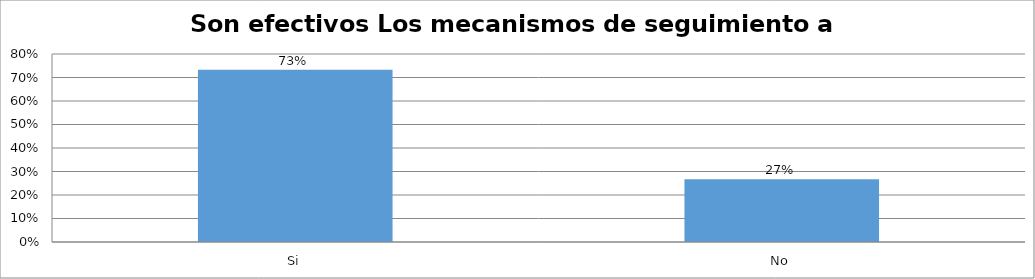
| Category | Series 0 |
|---|---|
| Si | 0.733 |
| No | 0.267 |